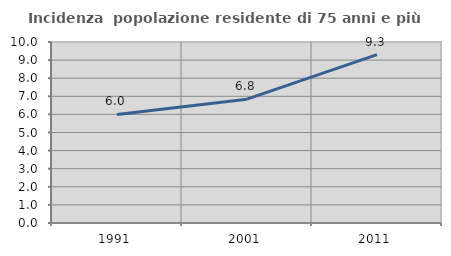
| Category | Incidenza  popolazione residente di 75 anni e più |
|---|---|
| 1991.0 | 5.999 |
| 2001.0 | 6.841 |
| 2011.0 | 9.305 |